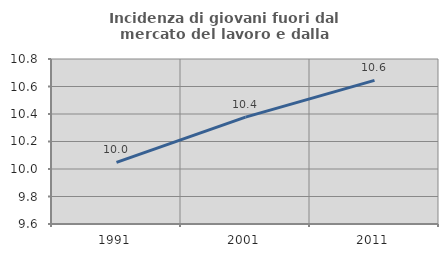
| Category | Incidenza di giovani fuori dal mercato del lavoro e dalla formazione  |
|---|---|
| 1991.0 | 10.048 |
| 2001.0 | 10.377 |
| 2011.0 | 10.644 |